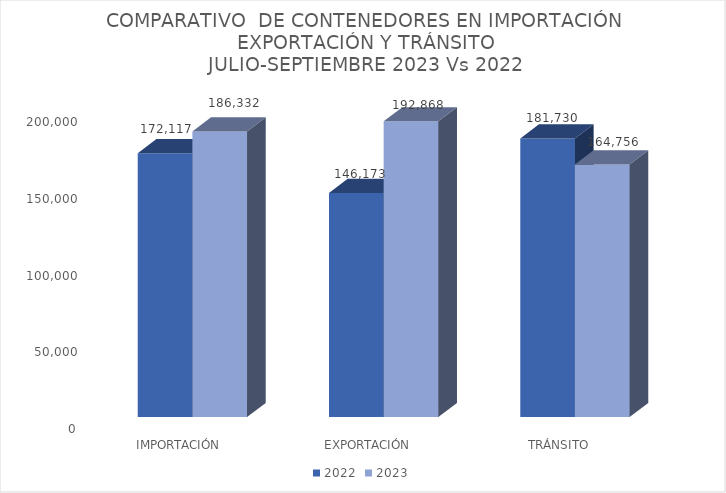
| Category | 2022 | 2023 |
|---|---|---|
|  IMPORTACIÓN | 172117 | 186331.5 |
| EXPORTACIÓN | 146173 | 192867.5 |
| TRÁNSITO | 181730 | 164756 |